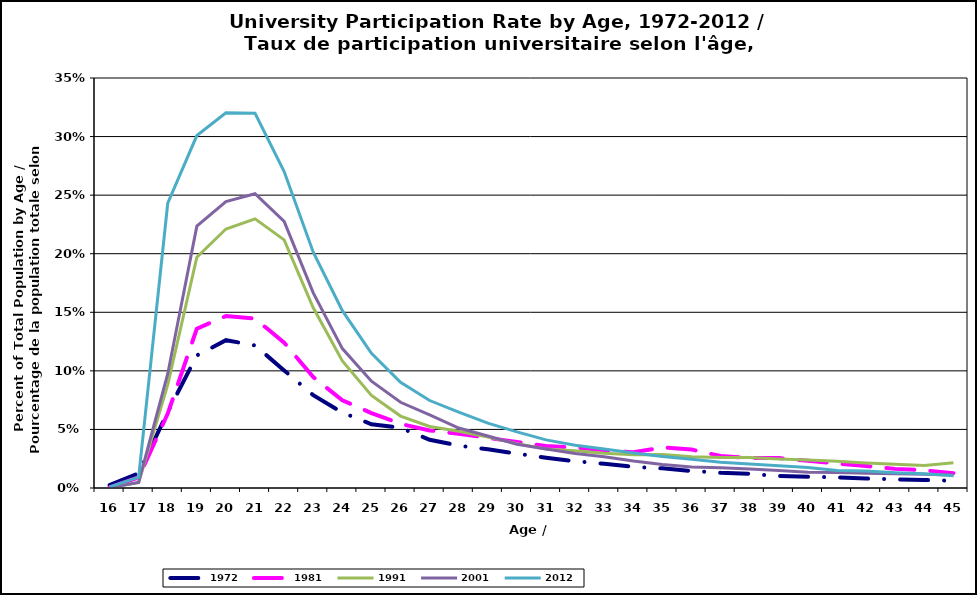
| Category | 1972 | 1981 | 1991 | 2001 | 2012 |
|---|---|---|---|---|---|
| 16.0 | 0.002 | 0.001 | 0 | 0 | 0.001 |
| 17.0 | 0.013 | 0.009 | 0.005 | 0.005 | 0.009 |
| 18.0 | 0.065 | 0.063 | 0.088 | 0.098 | 0.243 |
| 19.0 | 0.113 | 0.136 | 0.197 | 0.224 | 0.301 |
| 20.0 | 0.126 | 0.147 | 0.221 | 0.245 | 0.32 |
| 21.0 | 0.122 | 0.145 | 0.23 | 0.251 | 0.32 |
| 22.0 | 0.1 | 0.124 | 0.212 | 0.228 | 0.27 |
| 23.0 | 0.079 | 0.095 | 0.154 | 0.167 | 0.201 |
| 24.0 | 0.064 | 0.075 | 0.109 | 0.119 | 0.151 |
| 25.0 | 0.054 | 0.064 | 0.079 | 0.091 | 0.115 |
| 26.0 | 0.051 | 0.055 | 0.061 | 0.073 | 0.09 |
| 27.0 | 0.041 | 0.049 | 0.052 | 0.062 | 0.075 |
| 28.0 | 0.036 | 0.046 | 0.048 | 0.051 | 0.065 |
| 29.0 | 0.033 | 0.043 | 0.043 | 0.044 | 0.055 |
| 30.0 | 0.029 | 0.039 | 0.038 | 0.037 | 0.048 |
| 31.0 | 0.026 | 0.036 | 0.033 | 0.033 | 0.041 |
| 32.0 | 0.023 | 0.035 | 0.032 | 0.03 | 0.036 |
| 33.0 | 0.021 | 0.032 | 0.03 | 0.027 | 0.033 |
| 34.0 | 0.018 | 0.03 | 0.028 | 0.023 | 0.03 |
| 35.0 | 0.017 | 0.035 | 0.029 | 0.02 | 0.027 |
| 36.0 | 0.015 | 0.033 | 0.027 | 0.018 | 0.025 |
| 37.0 | 0.013 | 0.027 | 0.026 | 0.017 | 0.022 |
| 38.0 | 0.012 | 0.026 | 0.026 | 0.016 | 0.021 |
| 39.0 | 0.01 | 0.026 | 0.025 | 0.015 | 0.019 |
| 40.0 | 0.01 | 0.023 | 0.024 | 0.013 | 0.017 |
| 41.0 | 0.009 | 0.021 | 0.023 | 0.013 | 0.015 |
| 42.0 | 0.008 | 0.019 | 0.021 | 0.013 | 0.014 |
| 43.0 | 0.007 | 0.016 | 0.02 | 0.012 | 0.013 |
| 44.0 | 0.007 | 0.015 | 0.019 | 0.012 | 0.012 |
| 45.0 | 0.006 | 0.013 | 0.022 | 0.011 | 0.011 |